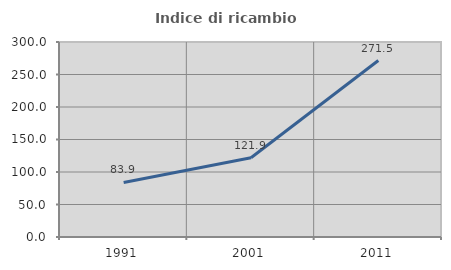
| Category | Indice di ricambio occupazionale  |
|---|---|
| 1991.0 | 83.926 |
| 2001.0 | 121.884 |
| 2011.0 | 271.494 |